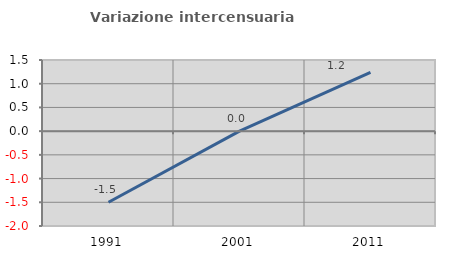
| Category | Variazione intercensuaria annua |
|---|---|
| 1991.0 | -1.5 |
| 2001.0 | 0 |
| 2011.0 | 1.238 |